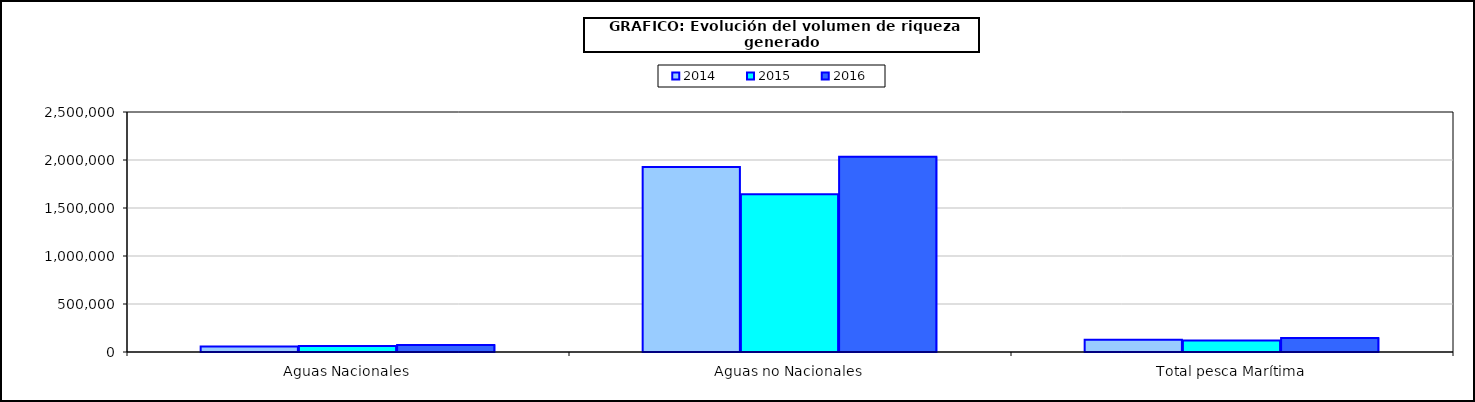
| Category | 2014 | 2015 | 2016 |
|---|---|---|---|
| 0 | 57813.868 | 61721.457 | 73392.8 |
| 1 | 1927671.969 | 1642691.799 | 2034075.664 |
| 2 | 127271.635 | 119982.334 | 145649.539 |